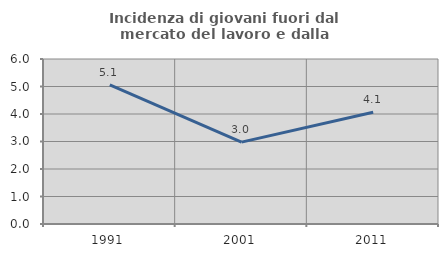
| Category | Incidenza di giovani fuori dal mercato del lavoro e dalla formazione  |
|---|---|
| 1991.0 | 5.056 |
| 2001.0 | 2.976 |
| 2011.0 | 4.061 |